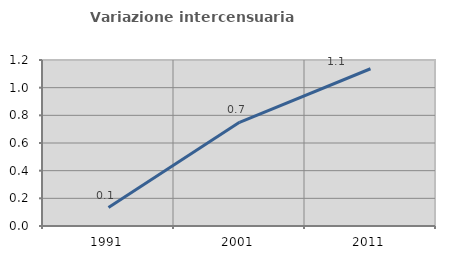
| Category | Variazione intercensuaria annua |
|---|---|
| 1991.0 | 0.134 |
| 2001.0 | 0.749 |
| 2011.0 | 1.137 |